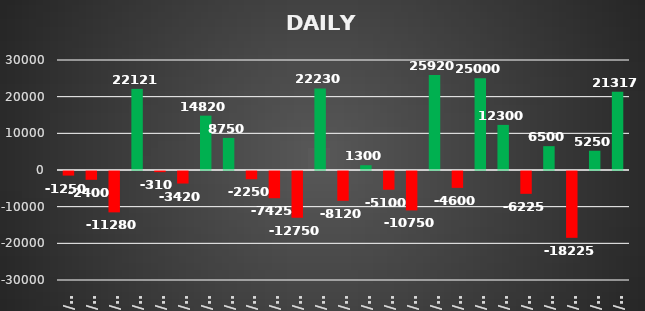
| Category | Series 0 |
|---|---|
| 2022-09-01 | -1250 |
| 2022-09-01 | -2400 |
| 2022-09-02 | -11280 |
| 2022-09-05 | 22121 |
| 2022-09-06 | -310 |
| 2022-09-06 | -3420 |
| 2022-09-07 | 14820 |
| 2022-09-08 | 8750 |
| 2022-09-09 | -2250 |
| 2022-09-12 | -7425 |
| 2022-09-13 | -12750 |
| 2022-09-14 | 22230 |
| 2022-09-15 | -8120 |
| 2022-09-16 | 1300 |
| 2022-09-19 | -5100 |
| 2022-09-20 | -10750 |
| 2022-09-21 | 25920 |
| 2022-09-22 | -4600 |
| 2022-09-23 | 25000 |
| 2022-09-26 | 12300 |
| 2022-09-27 | -6225 |
| 2022-09-27 | 6500 |
| 2022-09-28 | -18225 |
| 2022-09-29 | 5250 |
| 2022-09-30 | 21316.6 |